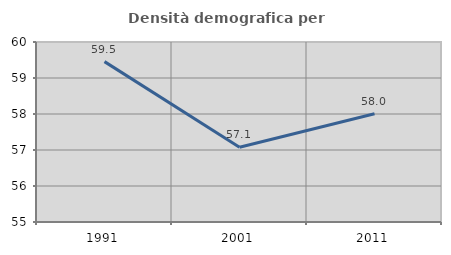
| Category | Densità demografica |
|---|---|
| 1991.0 | 59.454 |
| 2001.0 | 57.079 |
| 2011.0 | 58.006 |